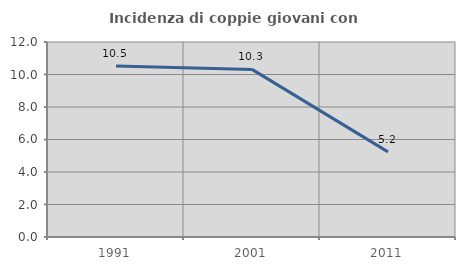
| Category | Incidenza di coppie giovani con figli |
|---|---|
| 1991.0 | 10.526 |
| 2001.0 | 10.314 |
| 2011.0 | 5.238 |